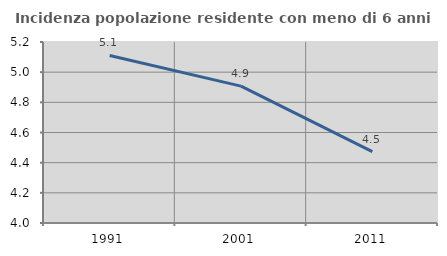
| Category | Incidenza popolazione residente con meno di 6 anni |
|---|---|
| 1991.0 | 5.111 |
| 2001.0 | 4.907 |
| 2011.0 | 4.474 |